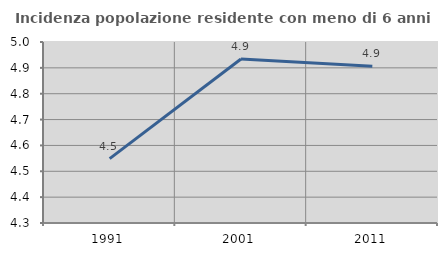
| Category | Incidenza popolazione residente con meno di 6 anni |
|---|---|
| 1991.0 | 4.549 |
| 2001.0 | 4.934 |
| 2011.0 | 4.906 |